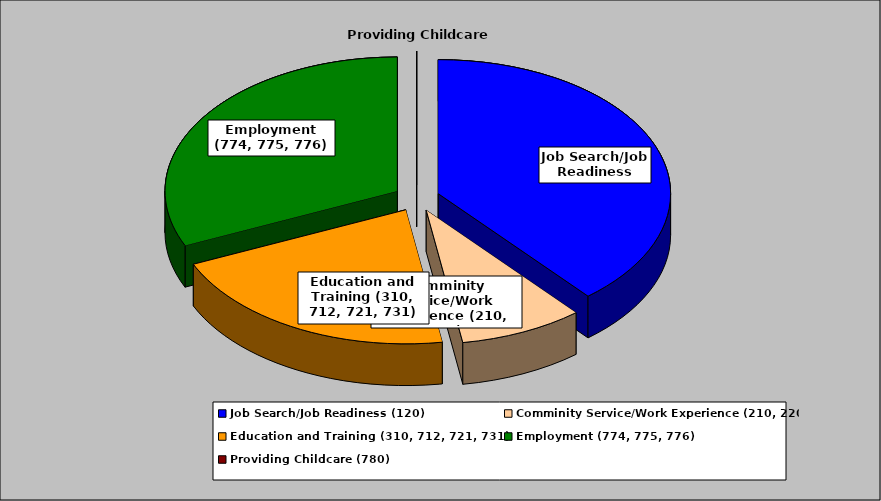
| Category | Series 0 |
|---|---|
| Job Search/Job Readiness (120) | 0.388 |
| Comminity Service/Work Experience (210, 220) | 0.086 |
| Education and Training (310, 712, 721, 731) | 0.209 |
| Employment (774, 775, 776) | 0.317 |
| Providing Childcare (780) | 0 |